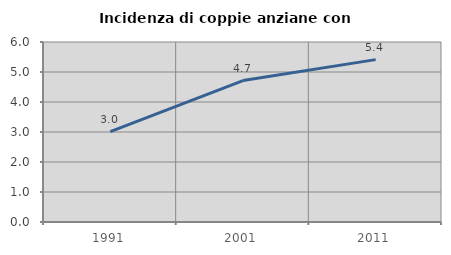
| Category | Incidenza di coppie anziane con figli |
|---|---|
| 1991.0 | 3.014 |
| 2001.0 | 4.715 |
| 2011.0 | 5.413 |